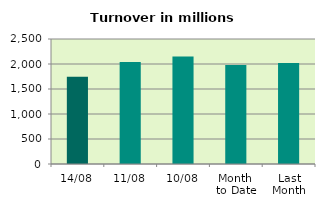
| Category | Series 0 |
|---|---|
| 14/08 | 1744.309 |
| 11/08 | 2040.757 |
| 10/08 | 2151.876 |
| Month 
to Date | 1978.493 |
| Last
Month | 2019.592 |